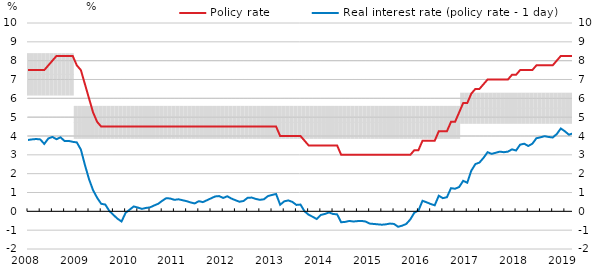
| Category | Series 3 | C | B | A |
|---|---|---|---|---|
| 2008-01-01 | 6.2 | 1.1 |  | 1.1 |
| 2008-02-01 | 6.2 | 1.1 |  | 1.1 |
| 2008-03-01 | 6.2 | 1.1 |  | 1.1 |
| 2008-04-01 | 6.2 | 1.1 |  | 1.1 |
| 2008-05-01 | 6.2 | 1.1 |  | 1.1 |
| 2008-06-01 | 6.2 | 1.1 |  | 1.1 |
| 2008-07-01 | 6.2 | 1.1 |  | 1.1 |
| 2008-08-01 | 6.2 | 1.1 |  | 1.1 |
| 2008-09-01 | 6.2 | 1.1 |  | 1.1 |
| 2008-10-01 | 6.2 | 1.1 |  | 1.1 |
| 2008-11-01 | 6.2 | 1.1 |  | 1.1 |
| 2008-12-01 | 6.2 | 1.1 |  | 1.1 |
| 2009-01-01 | 3.9 | 0.85 |  | 0.85 |
| 2009-02-01 | 3.9 | 0.85 |  | 0.85 |
| 2009-03-01 | 3.9 | 0.85 |  | 0.85 |
| 2009-04-01 | 3.9 | 0.85 |  | 0.85 |
| 2009-05-01 | 3.9 | 0.85 |  | 0.85 |
| 2009-06-01 | 3.9 | 0.85 |  | 0.85 |
| 2009-07-01 | 3.9 | 0.85 |  | 0.85 |
| 2009-08-01 | 3.9 | 0.85 |  | 0.85 |
| 2009-09-01 | 3.9 | 0.85 |  | 0.85 |
| 2009-10-01 | 3.9 | 0.85 |  | 0.85 |
| 2009-11-01 | 3.9 | 0.85 |  | 0.85 |
| 2009-12-01 | 3.9 | 0.85 |  | 0.85 |
| 2010-01-01 | 3.9 | 0.85 |  | 0.85 |
| 2010-02-01 | 3.9 | 0.85 |  | 0.85 |
| 2010-03-01 | 3.9 | 0.85 |  | 0.85 |
| 2010-04-01 | 3.9 | 0.85 |  | 0.85 |
| 2010-05-01 | 3.9 | 0.85 |  | 0.85 |
| 2010-06-01 | 3.9 | 0.85 |  | 0.85 |
| 2010-07-01 | 3.9 | 0.85 |  | 0.85 |
| 2010-08-01 | 3.9 | 0.85 |  | 0.85 |
| 2010-09-01 | 3.9 | 0.85 |  | 0.85 |
| 2010-10-01 | 3.9 | 0.85 |  | 0.85 |
| 2010-11-01 | 3.9 | 0.85 |  | 0.85 |
| 2010-12-01 | 3.9 | 0.85 |  | 0.85 |
| 2011-01-01 | 3.9 | 0.85 |  | 0.85 |
| 2011-02-01 | 3.9 | 0.85 |  | 0.85 |
| 2011-03-01 | 3.9 | 0.85 |  | 0.85 |
| 2011-04-01 | 3.9 | 0.85 |  | 0.85 |
| 2011-05-01 | 3.9 | 0.85 |  | 0.85 |
| 2011-06-01 | 3.9 | 0.85 |  | 0.85 |
| 2011-07-01 | 3.9 | 0.85 |  | 0.85 |
| 2011-08-01 | 3.9 | 0.85 |  | 0.85 |
| 2011-09-01 | 3.9 | 0.85 |  | 0.85 |
| 2011-10-01 | 3.9 | 0.85 |  | 0.85 |
| 2011-11-01 | 3.9 | 0.85 |  | 0.85 |
| 2011-12-01 | 3.9 | 0.85 |  | 0.85 |
| 2012-01-01 | 3.9 | 0.85 |  | 0.85 |
| 2012-02-01 | 3.9 | 0.85 |  | 0.85 |
| 2012-03-01 | 3.9 | 0.85 |  | 0.85 |
| 2012-04-01 | 3.9 | 0.85 |  | 0.85 |
| 2012-05-01 | 3.9 | 0.85 |  | 0.85 |
| 2012-06-01 | 3.9 | 0.85 |  | 0.85 |
| 2012-07-01 | 3.9 | 0.85 |  | 0.85 |
| 2012-08-01 | 3.9 | 0.85 |  | 0.85 |
| 2012-09-01 | 3.9 | 0.85 |  | 0.85 |
| 2012-10-01 | 3.9 | 0.85 |  | 0.85 |
| 2012-11-01 | 3.9 | 0.85 |  | 0.85 |
| 2012-12-01 | 3.9 | 0.85 |  | 0.85 |
| 2013-01-01 | 3.9 | 0.85 |  | 0.85 |
| 2013-02-01 | 3.9 | 0.85 |  | 0.85 |
| 2013-03-01 | 3.9 | 0.85 |  | 0.85 |
| 2013-04-01 | 3.9 | 0.85 |  | 0.85 |
| 2013-05-01 | 3.9 | 0.85 |  | 0.85 |
| 2013-06-01 | 3.9 | 0.85 |  | 0.85 |
| 2013-07-01 | 3.9 | 0.85 |  | 0.85 |
| 2013-08-01 | 3.9 | 0.85 |  | 0.85 |
| 2013-09-01 | 3.9 | 0.85 |  | 0.85 |
| 2013-10-01 | 3.9 | 0.85 |  | 0.85 |
| 2013-11-01 | 3.9 | 0.85 |  | 0.85 |
| 2013-12-01 | 3.9 | 0.85 |  | 0.85 |
| 2014-01-01 | 3.9 | 0.85 |  | 0.85 |
| 2014-02-01 | 3.9 | 0.85 |  | 0.85 |
| 2014-03-01 | 3.9 | 0.85 |  | 0.85 |
| 2014-04-01 | 3.9 | 0.85 |  | 0.85 |
| 2014-05-01 | 3.9 | 0.85 |  | 0.85 |
| 2014-06-01 | 3.9 | 0.85 |  | 0.85 |
| 2014-07-01 | 3.9 | 0.85 |  | 0.85 |
| 2014-08-01 | 3.9 | 0.85 |  | 0.85 |
| 2014-09-01 | 3.9 | 0.85 |  | 0.85 |
| 2014-10-01 | 3.9 | 0.85 |  | 0.85 |
| 2014-11-01 | 3.9 | 0.85 |  | 0.85 |
| 2014-12-01 | 3.9 | 0.85 |  | 0.85 |
| 2015-01-01 | 3.9 | 0.85 |  | 0.85 |
| 2015-02-01 | 3.9 | 0.85 |  | 0.85 |
| 2015-03-01 | 3.9 | 0.85 |  | 0.85 |
| 2015-04-01 | 3.9 | 0.85 |  | 0.85 |
| 2015-05-01 | 3.9 | 0.85 |  | 0.85 |
| 2015-06-01 | 3.9 | 0.85 |  | 0.85 |
| 2015-07-01 | 3.9 | 0.85 |  | 0.85 |
| 2015-08-01 | 3.9 | 0.85 |  | 0.85 |
| 2015-09-01 | 3.9 | 0.85 |  | 0.85 |
| 2015-10-01 | 3.9 | 0.85 |  | 0.85 |
| 2015-11-01 | 3.9 | 0.85 |  | 0.85 |
| 2015-12-01 | 3.9 | 0.85 |  | 0.85 |
| 2016-01-01 | 3.9 | 0.85 |  | 0.85 |
| 2016-02-01 | 3.9 | 0.85 |  | 0.85 |
| 2016-03-01 | 3.9 | 0.85 |  | 0.85 |
| 2016-04-01 | 3.9 | 0.85 |  | 0.85 |
| 2016-05-01 | 3.9 | 0.85 |  | 0.85 |
| 2016-06-01 | 3.9 | 0.85 |  | 0.85 |
| 2016-07-01 | 3.9 | 0.85 |  | 0.85 |
| 2016-08-01 | 3.9 | 0.85 |  | 0.85 |
| 2016-09-01 | 3.9 | 0.85 |  | 0.85 |
| 2016-10-01 | 3.9 | 0.85 |  | 0.85 |
| 2016-11-01 | 3.9 | 0.85 |  | 0.85 |
| 2016-12-01 | 4.7 | 0.8 |  | 0.8 |
| 2017-01-01 | 4.7 | 0.8 |  | 0.8 |
| 2017-02-01 | 4.7 | 0.8 |  | 0.8 |
| 2017-03-01 | 4.7 | 0.8 |  | 0.8 |
| 2017-04-01 | 4.7 | 0.8 |  | 0.8 |
| 2017-05-01 | 4.7 | 0.8 |  | 0.8 |
| 2017-06-01 | 4.7 | 0.8 |  | 0.8 |
| 2017-07-01 | 4.7 | 0.8 |  | 0.8 |
| 2017-08-01 | 4.7 | 0.8 |  | 0.8 |
| 2017-09-01 | 4.7 | 0.8 |  | 0.8 |
| 2017-10-01 | 4.7 | 0.8 |  | 0.8 |
| 2017-11-01 | 4.7 | 0.8 |  | 0.8 |
| 2017-12-01 | 4.7 | 0.8 |  | 0.8 |
| 2018-01-01 | 4.7 | 0.8 |  | 0.8 |
| 2018-02-01 | 4.7 | 0.8 |  | 0.8 |
| 2018-03-01 | 4.7 | 0.8 |  | 0.8 |
| 2018-04-01 | 4.7 | 0.8 |  | 0.8 |
| 2018-05-01 | 4.7 | 0.8 |  | 0.8 |
| 2018-06-01 | 4.7 | 0.8 |  | 0.8 |
| 2018-07-01 | 4.7 | 0.8 |  | 0.8 |
| 2018-08-01 | 4.7 | 0.8 |  | 0.8 |
| 2018-09-01 | 4.7 | 0.8 |  | 0.8 |
| 2018-10-01 | 4.7 | 0.8 |  | 0.8 |
| 2018-11-01 | 4.7 | 0.8 |  | 0.8 |
| 2018-12-01 | 4.7 | 0.8 |  | 0.8 |
| 2019-01-01 | 4.7 | 0.8 |  | 0.8 |
| 2019-02-01 | 4.7 | 0.8 |  | 0.8 |
| 2019-03-01 | 4.7 | 0.8 |  | 0.8 |